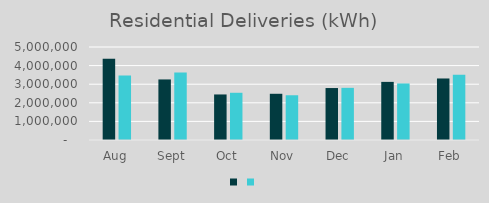
| Category | Series 1 | Series 0 |
|---|---|---|
| Aug | 4364840 | 3470448 |
| Sept | 3255766 | 3631455 |
| Oct | 2448610 | 2538922 |
| Nov | 2484917 | 2405818 |
| Dec | 2793607 | 2803771 |
| Jan | 3124442 | 3040217 |
| Feb | 3307618 | 3510451 |